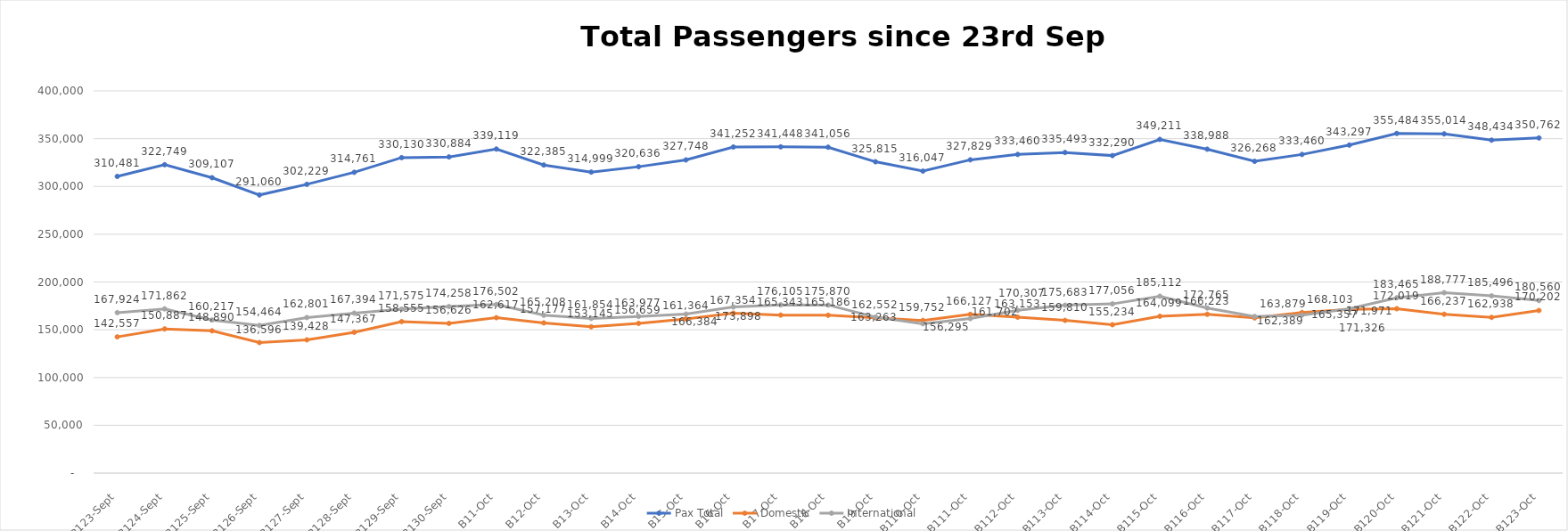
| Category | Pax Total | Domestic | International |
|---|---|---|---|
| 2023-09-23 | 310481 | 142557 | 167924 |
| 2023-09-24 | 322749 | 150887 | 171862 |
| 2023-09-25 | 309107 | 148890 | 160217 |
| 2023-09-26 | 291060 | 136596 | 154464 |
| 2023-09-27 | 302229 | 139428 | 162801 |
| 2023-09-28 | 314761 | 147367 | 167394 |
| 2023-09-29 | 330130 | 158555 | 171575 |
| 2023-09-30 | 330884 | 156626 | 174258 |
| 2023-10-01 | 339119 | 162617 | 176502 |
| 2023-10-02 | 322385 | 157177 | 165208 |
| 2023-10-03 | 314999 | 153145 | 161854 |
| 2023-10-04 | 320636 | 156659 | 163977 |
| 2023-10-05 | 327748 | 161364 | 166384 |
| 2023-10-06 | 341252 | 167354 | 173898 |
| 2023-10-07 | 341448 | 165343 | 176105 |
| 2023-10-08 | 341056 | 165186 | 175870 |
| 2023-10-09 | 325815 | 162552 | 163263 |
| 2023-10-10 | 316047 | 159752 | 156295 |
| 2023-10-11 | 327829 | 166127 | 161702 |
| 2023-10-12 | 333460 | 163153 | 170307 |
| 2023-10-13 | 335493 | 159810 | 175683 |
| 2023-10-14 | 332290 | 155234 | 177056 |
| 2023-10-15 | 349211 | 164099 | 185112 |
| 2023-10-16 | 338988 | 166223 | 172765 |
| 2023-10-17 | 326268 | 162389 | 163879 |
| 2023-10-18 | 333460 | 168103 | 165357 |
| 2023-10-19 | 343297 | 171326 | 171971 |
| 2023-10-20 | 355484 | 172019 | 183465 |
| 2023-10-21 | 355014 | 166237 | 188777 |
| 2023-10-22 | 348434 | 162938 | 185496 |
| 2023-10-23 | 350762 | 170202 | 180560 |